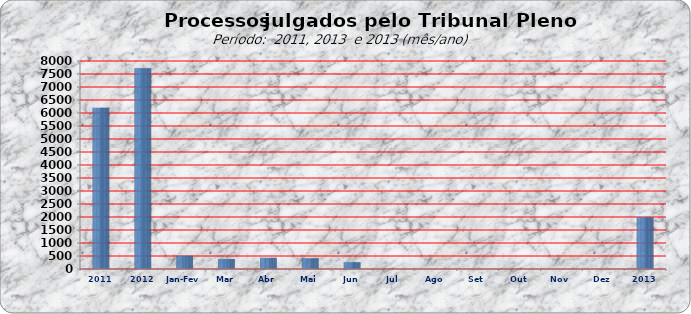
| Category | 6205 7722 509 381 429 411 264 0 0 0 0 0 0 |
|---|---|
| 2011 | 6205 |
| 2012 | 7722 |
| Jan-Fev | 509 |
| Mar | 381 |
| Abr | 429 |
| Mai | 411 |
| Jun | 264 |
| Jul | 0 |
| Ago | 0 |
| Set | 0 |
| Out | 0 |
| Nov | 0 |
| Dez | 0 |
| 2013 | 1994 |